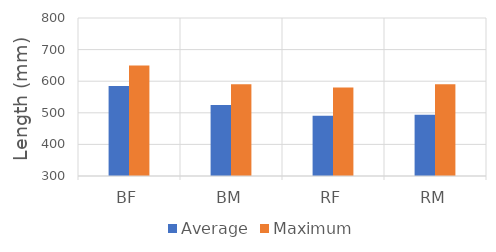
| Category | Average | Maximum |
|---|---|---|
| BF | 584.615 | 650 |
| BM | 525 | 590 |
| RF | 490.522 | 580 |
| RM | 493.86 | 590 |